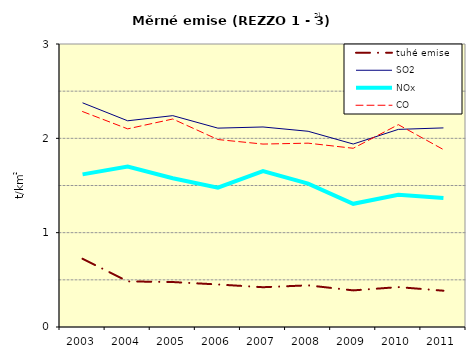
| Category | tuhé emise | SO2 | NOx | CO |
|---|---|---|---|---|
| 2003.0 | 0.724 | 2.377 | 1.618 | 2.284 |
| 2004.0 | 0.484 | 2.186 | 1.702 | 2.1 |
| 2005.0 | 0.477 | 2.24 | 1.577 | 2.205 |
| 2006.0 | 0.451 | 2.108 | 1.477 | 1.987 |
| 2007.0 | 0.422 | 2.12 | 1.653 | 1.939 |
| 2008.0 | 0.442 | 2.075 | 1.519 | 1.949 |
| 2009.0 | 0.388 | 1.94 | 1.306 | 1.895 |
| 2010.0 | 0.423 | 2.095 | 1.403 | 2.145 |
| 2011.0 | 0.385 | 2.111 | 1.368 | 1.881 |